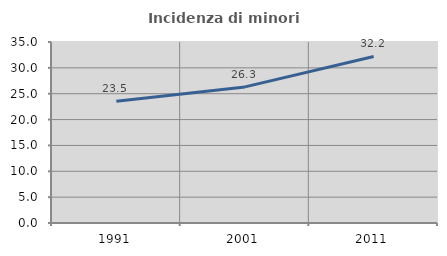
| Category | Incidenza di minori stranieri |
|---|---|
| 1991.0 | 23.529 |
| 2001.0 | 26.316 |
| 2011.0 | 32.212 |